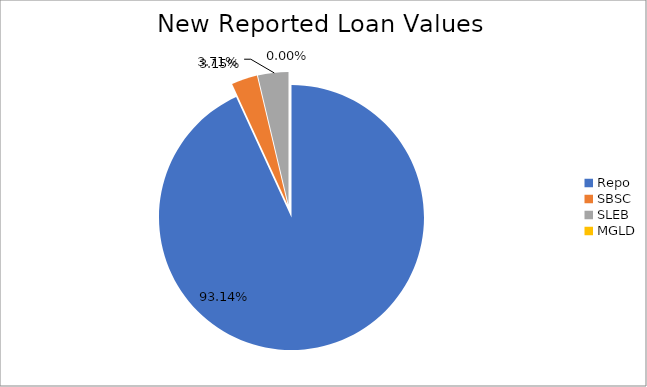
| Category | Series 0 |
|---|---|
| Repo | 9671638.642 |
| SBSC | 327254.443 |
| SLEB | 385225.108 |
| MGLD | 19.599 |